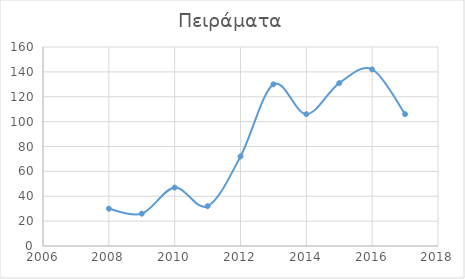
| Category | Πειράματα |
|---|---|
| 2008.0 | 30 |
| 2009.0 | 26 |
| 2010.0 | 47 |
| 2011.0 | 32 |
| 2012.0 | 72 |
| 2013.0 | 130 |
| 2014.0 | 106 |
| 2015.0 | 131 |
| 2016.0 | 142 |
| 2017.0 | 106 |